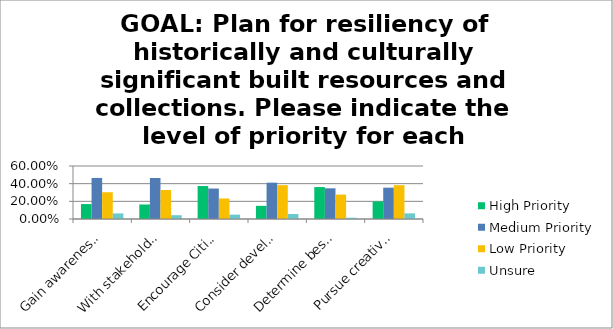
| Category | High Priority | Medium Priority | Low Priority | Unsure |
|---|---|---|---|---|
| Gain awareness of and reach out to programs like the Coordinated Statewide Emergency Preparedness for Cultural Heritage in Massachusetts (COSTEP MA) to ensure best practices in preparedness planning. | 0.169 | 0.465 | 0.303 | 0.063 |
| With stakeholder consultation, inventory and create a preparedness plan for the Town's historically and culturally significant buildings. | 0.164 | 0.464 | 0.329 | 0.043 |
| Encourage Citizen Corps Council Community Emergency Response Team (CERT) Training involvement by stakeholders to bolster preparedness and identify a chain of command in the event of an emergency. (Learn more here.) | 0.373 | 0.345 | 0.232 | 0.049 |
| Consider developing a building maintenance guide to make available to local property owners with a particular emphasis on preservation of older buildings, using the Secretary of the Interior’s Standards for the Treatment of Historic Properties and other re | 0.149 | 0.411 | 0.383 | 0.057 |
| Determine best practices for long-term storage and digitization of paper files, as well as a way to make these resources more accessible to the public. | 0.362 | 0.348 | 0.277 | 0.014 |
| Pursue creative forms of memory catching like oral histories of local residents and volunteer transcriptions and ensure the long term stability of these collections. Utilize state resources like the Roving Archivist program to help with planning. | 0.199 | 0.355 | 0.383 | 0.064 |